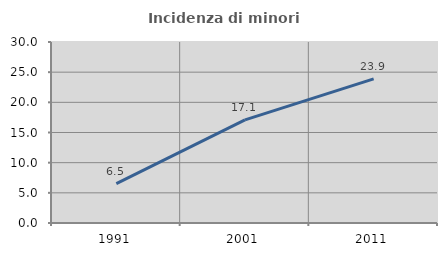
| Category | Incidenza di minori stranieri |
|---|---|
| 1991.0 | 6.513 |
| 2001.0 | 17.085 |
| 2011.0 | 23.882 |